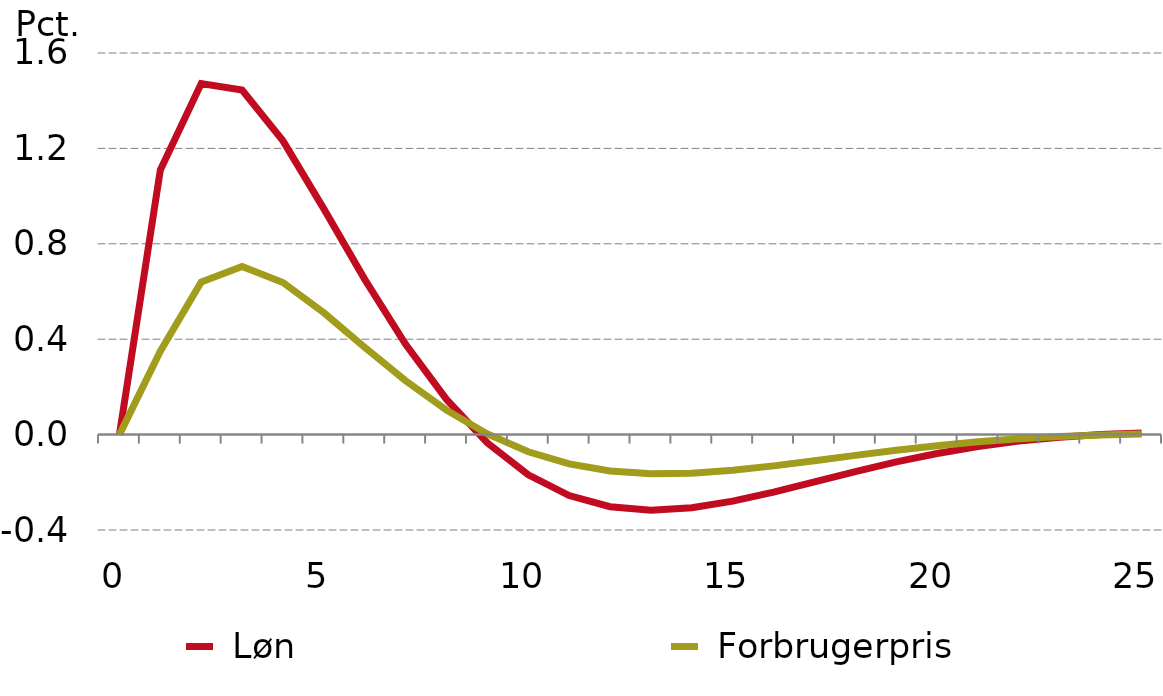
| Category |  Løn |  Forbrugerpris |
|---|---|---|
| 0.0 | 0 | 0 |
| nan | 1.11 | 0.35 |
| nan | 1.472 | 0.64 |
| nan | 1.445 | 0.704 |
| nan | 1.232 | 0.638 |
| 5.0 | 0.946 | 0.511 |
| nan | 0.651 | 0.366 |
| nan | 0.379 | 0.225 |
| nan | 0.147 | 0.102 |
| nan | -0.035 | 0.003 |
| 10.0 | -0.168 | -0.072 |
| nan | -0.255 | -0.123 |
| nan | -0.302 | -0.152 |
| nan | -0.317 | -0.164 |
| nan | -0.306 | -0.162 |
| 15.0 | -0.279 | -0.15 |
| nan | -0.241 | -0.131 |
| nan | -0.198 | -0.11 |
| nan | -0.155 | -0.087 |
| nan | -0.115 | -0.066 |
| 20.0 | -0.079 | -0.047 |
| nan | -0.05 | -0.03 |
| nan | -0.027 | -0.018 |
| nan | -0.011 | -0.008 |
| nan | 0 | -0.001 |
| 25.0 | 0.006 | 0.003 |